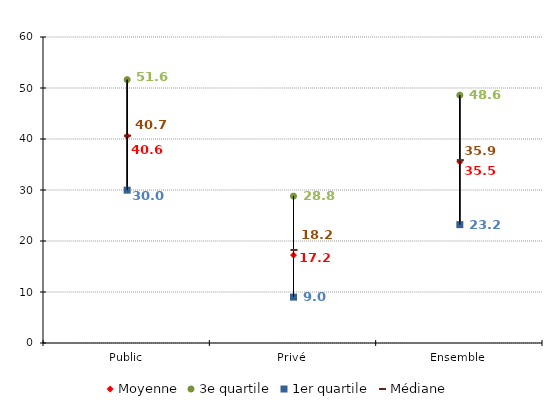
| Category | Moyenne | 3e quartile | 1er quartile | Médiane |
|---|---|---|---|---|
| Public | 40.588 | 51.638 | 29.967 | 40.659 |
| Privé | 17.21 | 28.797 | 8.994 | 18.243 |
| Ensemble | 35.507 | 48.589 | 23.207 | 35.861 |